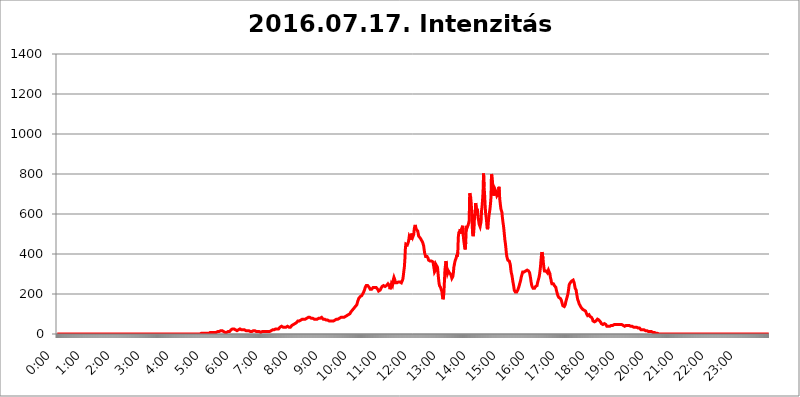
| Category | 2016.07.17. Intenzitás [W/m^2] |
|---|---|
| 0.0 | 0 |
| 0.0006944444444444445 | 0 |
| 0.001388888888888889 | 0 |
| 0.0020833333333333333 | 0 |
| 0.002777777777777778 | 0 |
| 0.003472222222222222 | 0 |
| 0.004166666666666667 | 0 |
| 0.004861111111111111 | 0 |
| 0.005555555555555556 | 0 |
| 0.0062499999999999995 | 0 |
| 0.006944444444444444 | 0 |
| 0.007638888888888889 | 0 |
| 0.008333333333333333 | 0 |
| 0.009027777777777779 | 0 |
| 0.009722222222222222 | 0 |
| 0.010416666666666666 | 0 |
| 0.011111111111111112 | 0 |
| 0.011805555555555555 | 0 |
| 0.012499999999999999 | 0 |
| 0.013194444444444444 | 0 |
| 0.013888888888888888 | 0 |
| 0.014583333333333332 | 0 |
| 0.015277777777777777 | 0 |
| 0.015972222222222224 | 0 |
| 0.016666666666666666 | 0 |
| 0.017361111111111112 | 0 |
| 0.018055555555555557 | 0 |
| 0.01875 | 0 |
| 0.019444444444444445 | 0 |
| 0.02013888888888889 | 0 |
| 0.020833333333333332 | 0 |
| 0.02152777777777778 | 0 |
| 0.022222222222222223 | 0 |
| 0.02291666666666667 | 0 |
| 0.02361111111111111 | 0 |
| 0.024305555555555556 | 0 |
| 0.024999999999999998 | 0 |
| 0.025694444444444447 | 0 |
| 0.02638888888888889 | 0 |
| 0.027083333333333334 | 0 |
| 0.027777777777777776 | 0 |
| 0.02847222222222222 | 0 |
| 0.029166666666666664 | 0 |
| 0.029861111111111113 | 0 |
| 0.030555555555555555 | 0 |
| 0.03125 | 0 |
| 0.03194444444444445 | 0 |
| 0.03263888888888889 | 0 |
| 0.03333333333333333 | 0 |
| 0.034027777777777775 | 0 |
| 0.034722222222222224 | 0 |
| 0.035416666666666666 | 0 |
| 0.036111111111111115 | 0 |
| 0.03680555555555556 | 0 |
| 0.0375 | 0 |
| 0.03819444444444444 | 0 |
| 0.03888888888888889 | 0 |
| 0.03958333333333333 | 0 |
| 0.04027777777777778 | 0 |
| 0.04097222222222222 | 0 |
| 0.041666666666666664 | 0 |
| 0.042361111111111106 | 0 |
| 0.04305555555555556 | 0 |
| 0.043750000000000004 | 0 |
| 0.044444444444444446 | 0 |
| 0.04513888888888889 | 0 |
| 0.04583333333333334 | 0 |
| 0.04652777777777778 | 0 |
| 0.04722222222222222 | 0 |
| 0.04791666666666666 | 0 |
| 0.04861111111111111 | 0 |
| 0.049305555555555554 | 0 |
| 0.049999999999999996 | 0 |
| 0.05069444444444445 | 0 |
| 0.051388888888888894 | 0 |
| 0.052083333333333336 | 0 |
| 0.05277777777777778 | 0 |
| 0.05347222222222222 | 0 |
| 0.05416666666666667 | 0 |
| 0.05486111111111111 | 0 |
| 0.05555555555555555 | 0 |
| 0.05625 | 0 |
| 0.05694444444444444 | 0 |
| 0.057638888888888885 | 0 |
| 0.05833333333333333 | 0 |
| 0.05902777777777778 | 0 |
| 0.059722222222222225 | 0 |
| 0.06041666666666667 | 0 |
| 0.061111111111111116 | 0 |
| 0.06180555555555556 | 0 |
| 0.0625 | 0 |
| 0.06319444444444444 | 0 |
| 0.06388888888888888 | 0 |
| 0.06458333333333334 | 0 |
| 0.06527777777777778 | 0 |
| 0.06597222222222222 | 0 |
| 0.06666666666666667 | 0 |
| 0.06736111111111111 | 0 |
| 0.06805555555555555 | 0 |
| 0.06874999999999999 | 0 |
| 0.06944444444444443 | 0 |
| 0.07013888888888889 | 0 |
| 0.07083333333333333 | 0 |
| 0.07152777777777779 | 0 |
| 0.07222222222222223 | 0 |
| 0.07291666666666667 | 0 |
| 0.07361111111111111 | 0 |
| 0.07430555555555556 | 0 |
| 0.075 | 0 |
| 0.07569444444444444 | 0 |
| 0.0763888888888889 | 0 |
| 0.07708333333333334 | 0 |
| 0.07777777777777778 | 0 |
| 0.07847222222222222 | 0 |
| 0.07916666666666666 | 0 |
| 0.0798611111111111 | 0 |
| 0.08055555555555556 | 0 |
| 0.08125 | 0 |
| 0.08194444444444444 | 0 |
| 0.08263888888888889 | 0 |
| 0.08333333333333333 | 0 |
| 0.08402777777777777 | 0 |
| 0.08472222222222221 | 0 |
| 0.08541666666666665 | 0 |
| 0.08611111111111112 | 0 |
| 0.08680555555555557 | 0 |
| 0.08750000000000001 | 0 |
| 0.08819444444444445 | 0 |
| 0.08888888888888889 | 0 |
| 0.08958333333333333 | 0 |
| 0.09027777777777778 | 0 |
| 0.09097222222222222 | 0 |
| 0.09166666666666667 | 0 |
| 0.09236111111111112 | 0 |
| 0.09305555555555556 | 0 |
| 0.09375 | 0 |
| 0.09444444444444444 | 0 |
| 0.09513888888888888 | 0 |
| 0.09583333333333333 | 0 |
| 0.09652777777777777 | 0 |
| 0.09722222222222222 | 0 |
| 0.09791666666666667 | 0 |
| 0.09861111111111111 | 0 |
| 0.09930555555555555 | 0 |
| 0.09999999999999999 | 0 |
| 0.10069444444444443 | 0 |
| 0.1013888888888889 | 0 |
| 0.10208333333333335 | 0 |
| 0.10277777777777779 | 0 |
| 0.10347222222222223 | 0 |
| 0.10416666666666667 | 0 |
| 0.10486111111111111 | 0 |
| 0.10555555555555556 | 0 |
| 0.10625 | 0 |
| 0.10694444444444444 | 0 |
| 0.1076388888888889 | 0 |
| 0.10833333333333334 | 0 |
| 0.10902777777777778 | 0 |
| 0.10972222222222222 | 0 |
| 0.1111111111111111 | 0 |
| 0.11180555555555556 | 0 |
| 0.11180555555555556 | 0 |
| 0.1125 | 0 |
| 0.11319444444444444 | 0 |
| 0.11388888888888889 | 0 |
| 0.11458333333333333 | 0 |
| 0.11527777777777777 | 0 |
| 0.11597222222222221 | 0 |
| 0.11666666666666665 | 0 |
| 0.1173611111111111 | 0 |
| 0.11805555555555557 | 0 |
| 0.11944444444444445 | 0 |
| 0.12013888888888889 | 0 |
| 0.12083333333333333 | 0 |
| 0.12152777777777778 | 0 |
| 0.12222222222222223 | 0 |
| 0.12291666666666667 | 0 |
| 0.12291666666666667 | 0 |
| 0.12361111111111112 | 0 |
| 0.12430555555555556 | 0 |
| 0.125 | 0 |
| 0.12569444444444444 | 0 |
| 0.12638888888888888 | 0 |
| 0.12708333333333333 | 0 |
| 0.16875 | 0 |
| 0.12847222222222224 | 0 |
| 0.12916666666666668 | 0 |
| 0.12986111111111112 | 0 |
| 0.13055555555555556 | 0 |
| 0.13125 | 0 |
| 0.13194444444444445 | 0 |
| 0.1326388888888889 | 0 |
| 0.13333333333333333 | 0 |
| 0.13402777777777777 | 0 |
| 0.13402777777777777 | 0 |
| 0.13472222222222222 | 0 |
| 0.13541666666666666 | 0 |
| 0.1361111111111111 | 0 |
| 0.13749999999999998 | 0 |
| 0.13819444444444443 | 0 |
| 0.1388888888888889 | 0 |
| 0.13958333333333334 | 0 |
| 0.14027777777777778 | 0 |
| 0.14097222222222222 | 0 |
| 0.14166666666666666 | 0 |
| 0.1423611111111111 | 0 |
| 0.14305555555555557 | 0 |
| 0.14375000000000002 | 0 |
| 0.14444444444444446 | 0 |
| 0.1451388888888889 | 0 |
| 0.1451388888888889 | 0 |
| 0.14652777777777778 | 0 |
| 0.14722222222222223 | 0 |
| 0.14791666666666667 | 0 |
| 0.1486111111111111 | 0 |
| 0.14930555555555555 | 0 |
| 0.15 | 0 |
| 0.15069444444444444 | 0 |
| 0.15138888888888888 | 0 |
| 0.15208333333333332 | 0 |
| 0.15277777777777776 | 0 |
| 0.15347222222222223 | 0 |
| 0.15416666666666667 | 0 |
| 0.15486111111111112 | 0 |
| 0.15555555555555556 | 0 |
| 0.15625 | 0 |
| 0.15694444444444444 | 0 |
| 0.15763888888888888 | 0 |
| 0.15833333333333333 | 0 |
| 0.15902777777777777 | 0 |
| 0.15972222222222224 | 0 |
| 0.16041666666666668 | 0 |
| 0.16111111111111112 | 0 |
| 0.16180555555555556 | 0 |
| 0.1625 | 0 |
| 0.16319444444444445 | 0 |
| 0.1638888888888889 | 0 |
| 0.16458333333333333 | 0 |
| 0.16527777777777777 | 0 |
| 0.16597222222222222 | 0 |
| 0.16666666666666666 | 0 |
| 0.1673611111111111 | 0 |
| 0.16805555555555554 | 0 |
| 0.16874999999999998 | 0 |
| 0.16944444444444443 | 0 |
| 0.17013888888888887 | 0 |
| 0.1708333333333333 | 0 |
| 0.17152777777777775 | 0 |
| 0.17222222222222225 | 0 |
| 0.1729166666666667 | 0 |
| 0.17361111111111113 | 0 |
| 0.17430555555555557 | 0 |
| 0.17500000000000002 | 0 |
| 0.17569444444444446 | 0 |
| 0.1763888888888889 | 0 |
| 0.17708333333333334 | 0 |
| 0.17777777777777778 | 0 |
| 0.17847222222222223 | 0 |
| 0.17916666666666667 | 0 |
| 0.1798611111111111 | 0 |
| 0.18055555555555555 | 0 |
| 0.18125 | 0 |
| 0.18194444444444444 | 0 |
| 0.1826388888888889 | 0 |
| 0.18333333333333335 | 0 |
| 0.1840277777777778 | 0 |
| 0.18472222222222223 | 0 |
| 0.18541666666666667 | 0 |
| 0.18611111111111112 | 0 |
| 0.18680555555555556 | 0 |
| 0.1875 | 0 |
| 0.18819444444444444 | 0 |
| 0.18888888888888888 | 0 |
| 0.18958333333333333 | 0 |
| 0.19027777777777777 | 0 |
| 0.1909722222222222 | 0 |
| 0.19166666666666665 | 0 |
| 0.19236111111111112 | 0 |
| 0.19305555555555554 | 0 |
| 0.19375 | 0 |
| 0.19444444444444445 | 0 |
| 0.1951388888888889 | 0 |
| 0.19583333333333333 | 0 |
| 0.19652777777777777 | 0 |
| 0.19722222222222222 | 0 |
| 0.19791666666666666 | 0 |
| 0.1986111111111111 | 0 |
| 0.19930555555555554 | 0 |
| 0.19999999999999998 | 0 |
| 0.20069444444444443 | 0 |
| 0.20138888888888887 | 3.525 |
| 0.2020833333333333 | 3.525 |
| 0.2027777777777778 | 3.525 |
| 0.2034722222222222 | 3.525 |
| 0.2041666666666667 | 3.525 |
| 0.20486111111111113 | 3.525 |
| 0.20555555555555557 | 3.525 |
| 0.20625000000000002 | 3.525 |
| 0.20694444444444446 | 3.525 |
| 0.2076388888888889 | 3.525 |
| 0.20833333333333334 | 3.525 |
| 0.20902777777777778 | 3.525 |
| 0.20972222222222223 | 3.525 |
| 0.21041666666666667 | 3.525 |
| 0.2111111111111111 | 3.525 |
| 0.21180555555555555 | 3.525 |
| 0.2125 | 3.525 |
| 0.21319444444444444 | 7.887 |
| 0.2138888888888889 | 3.525 |
| 0.21458333333333335 | 7.887 |
| 0.2152777777777778 | 7.887 |
| 0.21597222222222223 | 7.887 |
| 0.21666666666666667 | 7.887 |
| 0.21736111111111112 | 7.887 |
| 0.21805555555555556 | 7.887 |
| 0.21875 | 7.887 |
| 0.21944444444444444 | 7.887 |
| 0.22013888888888888 | 7.887 |
| 0.22083333333333333 | 7.887 |
| 0.22152777777777777 | 12.257 |
| 0.2222222222222222 | 7.887 |
| 0.22291666666666665 | 7.887 |
| 0.2236111111111111 | 12.257 |
| 0.22430555555555556 | 12.257 |
| 0.225 | 12.257 |
| 0.22569444444444445 | 12.257 |
| 0.2263888888888889 | 12.257 |
| 0.22708333333333333 | 12.257 |
| 0.22777777777777777 | 12.257 |
| 0.22847222222222222 | 16.636 |
| 0.22916666666666666 | 16.636 |
| 0.2298611111111111 | 16.636 |
| 0.23055555555555554 | 16.636 |
| 0.23124999999999998 | 16.636 |
| 0.23194444444444443 | 16.636 |
| 0.23263888888888887 | 12.257 |
| 0.2333333333333333 | 12.257 |
| 0.2340277777777778 | 12.257 |
| 0.2347222222222222 | 12.257 |
| 0.2354166666666667 | 7.887 |
| 0.23611111111111113 | 7.887 |
| 0.23680555555555557 | 7.887 |
| 0.23750000000000002 | 7.887 |
| 0.23819444444444446 | 7.887 |
| 0.2388888888888889 | 7.887 |
| 0.23958333333333334 | 12.257 |
| 0.24027777777777778 | 12.257 |
| 0.24097222222222223 | 12.257 |
| 0.24166666666666667 | 12.257 |
| 0.2423611111111111 | 12.257 |
| 0.24305555555555555 | 16.636 |
| 0.24375 | 21.024 |
| 0.24444444444444446 | 21.024 |
| 0.24513888888888888 | 21.024 |
| 0.24583333333333335 | 25.419 |
| 0.2465277777777778 | 25.419 |
| 0.24722222222222223 | 25.419 |
| 0.24791666666666667 | 25.419 |
| 0.24861111111111112 | 21.024 |
| 0.24930555555555556 | 21.024 |
| 0.25 | 21.024 |
| 0.25069444444444444 | 21.024 |
| 0.2513888888888889 | 16.636 |
| 0.2520833333333333 | 16.636 |
| 0.25277777777777777 | 21.024 |
| 0.2534722222222222 | 21.024 |
| 0.25416666666666665 | 21.024 |
| 0.2548611111111111 | 25.419 |
| 0.2555555555555556 | 25.419 |
| 0.25625000000000003 | 25.419 |
| 0.2569444444444445 | 25.419 |
| 0.2576388888888889 | 21.024 |
| 0.25833333333333336 | 21.024 |
| 0.2590277777777778 | 21.024 |
| 0.25972222222222224 | 21.024 |
| 0.2604166666666667 | 21.024 |
| 0.2611111111111111 | 21.024 |
| 0.26180555555555557 | 21.024 |
| 0.2625 | 21.024 |
| 0.26319444444444445 | 21.024 |
| 0.2638888888888889 | 16.636 |
| 0.26458333333333334 | 16.636 |
| 0.2652777777777778 | 16.636 |
| 0.2659722222222222 | 16.636 |
| 0.26666666666666666 | 16.636 |
| 0.2673611111111111 | 16.636 |
| 0.26805555555555555 | 16.636 |
| 0.26875 | 16.636 |
| 0.26944444444444443 | 12.257 |
| 0.2701388888888889 | 12.257 |
| 0.2708333333333333 | 12.257 |
| 0.27152777777777776 | 12.257 |
| 0.2722222222222222 | 12.257 |
| 0.27291666666666664 | 12.257 |
| 0.2736111111111111 | 12.257 |
| 0.2743055555555555 | 16.636 |
| 0.27499999999999997 | 16.636 |
| 0.27569444444444446 | 12.257 |
| 0.27638888888888885 | 16.636 |
| 0.27708333333333335 | 16.636 |
| 0.2777777777777778 | 16.636 |
| 0.27847222222222223 | 16.636 |
| 0.2791666666666667 | 12.257 |
| 0.2798611111111111 | 12.257 |
| 0.28055555555555556 | 12.257 |
| 0.28125 | 12.257 |
| 0.28194444444444444 | 12.257 |
| 0.2826388888888889 | 12.257 |
| 0.2833333333333333 | 12.257 |
| 0.28402777777777777 | 12.257 |
| 0.2847222222222222 | 7.887 |
| 0.28541666666666665 | 7.887 |
| 0.28611111111111115 | 12.257 |
| 0.28680555555555554 | 12.257 |
| 0.28750000000000003 | 12.257 |
| 0.2881944444444445 | 7.887 |
| 0.2888888888888889 | 12.257 |
| 0.28958333333333336 | 12.257 |
| 0.2902777777777778 | 12.257 |
| 0.29097222222222224 | 12.257 |
| 0.2916666666666667 | 12.257 |
| 0.2923611111111111 | 12.257 |
| 0.29305555555555557 | 12.257 |
| 0.29375 | 12.257 |
| 0.29444444444444445 | 12.257 |
| 0.2951388888888889 | 12.257 |
| 0.29583333333333334 | 12.257 |
| 0.2965277777777778 | 12.257 |
| 0.2972222222222222 | 12.257 |
| 0.29791666666666666 | 12.257 |
| 0.2986111111111111 | 16.636 |
| 0.29930555555555555 | 16.636 |
| 0.3 | 16.636 |
| 0.30069444444444443 | 21.024 |
| 0.3013888888888889 | 21.024 |
| 0.3020833333333333 | 21.024 |
| 0.30277777777777776 | 21.024 |
| 0.3034722222222222 | 21.024 |
| 0.30416666666666664 | 21.024 |
| 0.3048611111111111 | 25.419 |
| 0.3055555555555555 | 25.419 |
| 0.30624999999999997 | 25.419 |
| 0.3069444444444444 | 25.419 |
| 0.3076388888888889 | 25.419 |
| 0.30833333333333335 | 25.419 |
| 0.3090277777777778 | 25.419 |
| 0.30972222222222223 | 25.419 |
| 0.3104166666666667 | 25.419 |
| 0.3111111111111111 | 29.823 |
| 0.31180555555555556 | 29.823 |
| 0.3125 | 34.234 |
| 0.31319444444444444 | 34.234 |
| 0.3138888888888889 | 38.653 |
| 0.3145833333333333 | 38.653 |
| 0.31527777777777777 | 38.653 |
| 0.3159722222222222 | 38.653 |
| 0.31666666666666665 | 34.234 |
| 0.31736111111111115 | 38.653 |
| 0.31805555555555554 | 34.234 |
| 0.31875000000000003 | 34.234 |
| 0.3194444444444445 | 34.234 |
| 0.3201388888888889 | 34.234 |
| 0.32083333333333336 | 34.234 |
| 0.3215277777777778 | 34.234 |
| 0.32222222222222224 | 34.234 |
| 0.3229166666666667 | 38.653 |
| 0.3236111111111111 | 34.234 |
| 0.32430555555555557 | 34.234 |
| 0.325 | 34.234 |
| 0.32569444444444445 | 29.823 |
| 0.3263888888888889 | 34.234 |
| 0.32708333333333334 | 34.234 |
| 0.3277777777777778 | 34.234 |
| 0.3284722222222222 | 38.653 |
| 0.32916666666666666 | 43.079 |
| 0.3298611111111111 | 43.079 |
| 0.33055555555555555 | 47.511 |
| 0.33125 | 47.511 |
| 0.33194444444444443 | 51.951 |
| 0.3326388888888889 | 51.951 |
| 0.3333333333333333 | 51.951 |
| 0.3340277777777778 | 56.398 |
| 0.3347222222222222 | 56.398 |
| 0.3354166666666667 | 56.398 |
| 0.3361111111111111 | 60.85 |
| 0.3368055555555556 | 60.85 |
| 0.33749999999999997 | 65.31 |
| 0.33819444444444446 | 65.31 |
| 0.33888888888888885 | 65.31 |
| 0.33958333333333335 | 65.31 |
| 0.34027777777777773 | 65.31 |
| 0.34097222222222223 | 69.775 |
| 0.3416666666666666 | 69.775 |
| 0.3423611111111111 | 74.246 |
| 0.3430555555555555 | 74.246 |
| 0.34375 | 74.246 |
| 0.3444444444444445 | 74.246 |
| 0.3451388888888889 | 74.246 |
| 0.3458333333333334 | 74.246 |
| 0.34652777777777777 | 74.246 |
| 0.34722222222222227 | 74.246 |
| 0.34791666666666665 | 74.246 |
| 0.34861111111111115 | 74.246 |
| 0.34930555555555554 | 78.722 |
| 0.35000000000000003 | 78.722 |
| 0.3506944444444444 | 83.205 |
| 0.3513888888888889 | 83.205 |
| 0.3520833333333333 | 83.205 |
| 0.3527777777777778 | 83.205 |
| 0.3534722222222222 | 83.205 |
| 0.3541666666666667 | 83.205 |
| 0.3548611111111111 | 83.205 |
| 0.35555555555555557 | 78.722 |
| 0.35625 | 78.722 |
| 0.35694444444444445 | 78.722 |
| 0.3576388888888889 | 78.722 |
| 0.35833333333333334 | 78.722 |
| 0.3590277777777778 | 74.246 |
| 0.3597222222222222 | 74.246 |
| 0.36041666666666666 | 74.246 |
| 0.3611111111111111 | 74.246 |
| 0.36180555555555555 | 74.246 |
| 0.3625 | 74.246 |
| 0.36319444444444443 | 74.246 |
| 0.3638888888888889 | 74.246 |
| 0.3645833333333333 | 74.246 |
| 0.3652777777777778 | 78.722 |
| 0.3659722222222222 | 78.722 |
| 0.3666666666666667 | 78.722 |
| 0.3673611111111111 | 78.722 |
| 0.3680555555555556 | 78.722 |
| 0.36874999999999997 | 78.722 |
| 0.36944444444444446 | 78.722 |
| 0.37013888888888885 | 83.205 |
| 0.37083333333333335 | 83.205 |
| 0.37152777777777773 | 78.722 |
| 0.37222222222222223 | 78.722 |
| 0.3729166666666666 | 74.246 |
| 0.3736111111111111 | 74.246 |
| 0.3743055555555555 | 74.246 |
| 0.375 | 74.246 |
| 0.3756944444444445 | 69.775 |
| 0.3763888888888889 | 69.775 |
| 0.3770833333333334 | 69.775 |
| 0.37777777777777777 | 69.775 |
| 0.37847222222222227 | 69.775 |
| 0.37916666666666665 | 69.775 |
| 0.37986111111111115 | 69.775 |
| 0.38055555555555554 | 65.31 |
| 0.38125000000000003 | 65.31 |
| 0.3819444444444444 | 65.31 |
| 0.3826388888888889 | 65.31 |
| 0.3833333333333333 | 65.31 |
| 0.3840277777777778 | 65.31 |
| 0.3847222222222222 | 65.31 |
| 0.3854166666666667 | 65.31 |
| 0.3861111111111111 | 65.31 |
| 0.38680555555555557 | 65.31 |
| 0.3875 | 65.31 |
| 0.38819444444444445 | 65.31 |
| 0.3888888888888889 | 69.775 |
| 0.38958333333333334 | 69.775 |
| 0.3902777777777778 | 69.775 |
| 0.3909722222222222 | 69.775 |
| 0.39166666666666666 | 74.246 |
| 0.3923611111111111 | 74.246 |
| 0.39305555555555555 | 74.246 |
| 0.39375 | 74.246 |
| 0.39444444444444443 | 74.246 |
| 0.3951388888888889 | 78.722 |
| 0.3958333333333333 | 78.722 |
| 0.3965277777777778 | 78.722 |
| 0.3972222222222222 | 83.205 |
| 0.3979166666666667 | 83.205 |
| 0.3986111111111111 | 83.205 |
| 0.3993055555555556 | 83.205 |
| 0.39999999999999997 | 83.205 |
| 0.40069444444444446 | 83.205 |
| 0.40138888888888885 | 83.205 |
| 0.40208333333333335 | 83.205 |
| 0.40277777777777773 | 83.205 |
| 0.40347222222222223 | 87.692 |
| 0.4041666666666666 | 87.692 |
| 0.4048611111111111 | 87.692 |
| 0.4055555555555555 | 87.692 |
| 0.40625 | 92.184 |
| 0.4069444444444445 | 92.184 |
| 0.4076388888888889 | 92.184 |
| 0.4083333333333334 | 96.682 |
| 0.40902777777777777 | 96.682 |
| 0.40972222222222227 | 101.184 |
| 0.41041666666666665 | 101.184 |
| 0.41111111111111115 | 105.69 |
| 0.41180555555555554 | 110.201 |
| 0.41250000000000003 | 110.201 |
| 0.4131944444444444 | 114.716 |
| 0.4138888888888889 | 119.235 |
| 0.4145833333333333 | 119.235 |
| 0.4152777777777778 | 123.758 |
| 0.4159722222222222 | 128.284 |
| 0.4166666666666667 | 128.284 |
| 0.4173611111111111 | 132.814 |
| 0.41805555555555557 | 137.347 |
| 0.41875 | 137.347 |
| 0.41944444444444445 | 141.884 |
| 0.4201388888888889 | 146.423 |
| 0.42083333333333334 | 155.509 |
| 0.4215277777777778 | 164.605 |
| 0.4222222222222222 | 169.156 |
| 0.42291666666666666 | 178.264 |
| 0.4236111111111111 | 182.82 |
| 0.42430555555555555 | 182.82 |
| 0.425 | 187.378 |
| 0.42569444444444443 | 187.378 |
| 0.4263888888888889 | 187.378 |
| 0.4270833333333333 | 191.937 |
| 0.4277777777777778 | 196.497 |
| 0.4284722222222222 | 201.058 |
| 0.4291666666666667 | 205.62 |
| 0.4298611111111111 | 210.182 |
| 0.4305555555555556 | 214.746 |
| 0.43124999999999997 | 223.873 |
| 0.43194444444444446 | 233 |
| 0.43263888888888885 | 237.564 |
| 0.43333333333333335 | 242.127 |
| 0.43402777777777773 | 246.689 |
| 0.43472222222222223 | 242.127 |
| 0.4354166666666666 | 242.127 |
| 0.4361111111111111 | 242.127 |
| 0.4368055555555555 | 237.564 |
| 0.4375 | 233 |
| 0.4381944444444445 | 228.436 |
| 0.4388888888888889 | 223.873 |
| 0.4395833333333334 | 223.873 |
| 0.44027777777777777 | 219.309 |
| 0.44097222222222227 | 223.873 |
| 0.44166666666666665 | 223.873 |
| 0.44236111111111115 | 228.436 |
| 0.44305555555555554 | 233 |
| 0.44375000000000003 | 233 |
| 0.4444444444444444 | 237.564 |
| 0.4451388888888889 | 233 |
| 0.4458333333333333 | 233 |
| 0.4465277777777778 | 233 |
| 0.4472222222222222 | 233 |
| 0.4479166666666667 | 233 |
| 0.4486111111111111 | 228.436 |
| 0.44930555555555557 | 223.873 |
| 0.45 | 219.309 |
| 0.45069444444444445 | 214.746 |
| 0.4513888888888889 | 214.746 |
| 0.45208333333333334 | 214.746 |
| 0.4527777777777778 | 219.309 |
| 0.4534722222222222 | 223.873 |
| 0.45416666666666666 | 228.436 |
| 0.4548611111111111 | 233 |
| 0.45555555555555555 | 237.564 |
| 0.45625 | 237.564 |
| 0.45694444444444443 | 237.564 |
| 0.4576388888888889 | 242.127 |
| 0.4583333333333333 | 237.564 |
| 0.4590277777777778 | 237.564 |
| 0.4597222222222222 | 237.564 |
| 0.4604166666666667 | 242.127 |
| 0.4611111111111111 | 242.127 |
| 0.4618055555555556 | 242.127 |
| 0.46249999999999997 | 246.689 |
| 0.46319444444444446 | 246.689 |
| 0.46388888888888885 | 251.251 |
| 0.46458333333333335 | 255.813 |
| 0.46527777777777773 | 255.813 |
| 0.46597222222222223 | 242.127 |
| 0.4666666666666666 | 223.873 |
| 0.4673611111111111 | 223.873 |
| 0.4680555555555555 | 237.564 |
| 0.46875 | 251.251 |
| 0.4694444444444445 | 246.689 |
| 0.4701388888888889 | 242.127 |
| 0.4708333333333334 | 255.813 |
| 0.47152777777777777 | 274.047 |
| 0.47222222222222227 | 283.156 |
| 0.47291666666666665 | 278.603 |
| 0.47361111111111115 | 269.49 |
| 0.47430555555555554 | 255.813 |
| 0.47500000000000003 | 255.813 |
| 0.4756944444444444 | 260.373 |
| 0.4763888888888889 | 255.813 |
| 0.4770833333333333 | 251.251 |
| 0.4777777777777778 | 255.813 |
| 0.4784722222222222 | 260.373 |
| 0.4791666666666667 | 264.932 |
| 0.4798611111111111 | 264.932 |
| 0.48055555555555557 | 260.373 |
| 0.48125 | 260.373 |
| 0.48194444444444445 | 260.373 |
| 0.4826388888888889 | 255.813 |
| 0.48333333333333334 | 255.813 |
| 0.4840277777777778 | 260.373 |
| 0.4847222222222222 | 274.047 |
| 0.48541666666666666 | 292.259 |
| 0.4861111111111111 | 314.98 |
| 0.48680555555555555 | 333.113 |
| 0.4875 | 369.23 |
| 0.48819444444444443 | 422.943 |
| 0.4888888888888889 | 449.551 |
| 0.4895833333333333 | 453.968 |
| 0.4902777777777778 | 449.551 |
| 0.4909722222222222 | 445.129 |
| 0.4916666666666667 | 449.551 |
| 0.4923611111111111 | 458.38 |
| 0.4930555555555556 | 471.582 |
| 0.49374999999999997 | 489.108 |
| 0.49444444444444446 | 493.475 |
| 0.49513888888888885 | 480.356 |
| 0.49583333333333335 | 471.582 |
| 0.49652777777777773 | 475.972 |
| 0.49722222222222223 | 502.192 |
| 0.4979166666666666 | 493.475 |
| 0.4986111111111111 | 484.735 |
| 0.4993055555555555 | 489.108 |
| 0.5 | 497.836 |
| 0.5006944444444444 | 523.88 |
| 0.5013888888888889 | 536.82 |
| 0.5020833333333333 | 545.416 |
| 0.5027777777777778 | 532.513 |
| 0.5034722222222222 | 523.88 |
| 0.5041666666666667 | 519.555 |
| 0.5048611111111111 | 519.555 |
| 0.5055555555555555 | 515.223 |
| 0.50625 | 502.192 |
| 0.5069444444444444 | 489.108 |
| 0.5076388888888889 | 489.108 |
| 0.5083333333333333 | 484.735 |
| 0.5090277777777777 | 480.356 |
| 0.5097222222222222 | 480.356 |
| 0.5104166666666666 | 475.972 |
| 0.5111111111111112 | 467.187 |
| 0.5118055555555555 | 462.786 |
| 0.5125000000000001 | 458.38 |
| 0.5131944444444444 | 449.551 |
| 0.513888888888889 | 440.702 |
| 0.5145833333333333 | 422.943 |
| 0.5152777777777778 | 405.108 |
| 0.5159722222222222 | 396.164 |
| 0.5166666666666667 | 387.202 |
| 0.517361111111111 | 387.202 |
| 0.5180555555555556 | 387.202 |
| 0.5187499999999999 | 387.202 |
| 0.5194444444444445 | 382.715 |
| 0.5201388888888888 | 378.224 |
| 0.5208333333333334 | 369.23 |
| 0.5215277777777778 | 369.23 |
| 0.5222222222222223 | 369.23 |
| 0.5229166666666667 | 364.728 |
| 0.5236111111111111 | 360.221 |
| 0.5243055555555556 | 360.221 |
| 0.525 | 364.728 |
| 0.5256944444444445 | 369.23 |
| 0.5263888888888889 | 369.23 |
| 0.5270833333333333 | 360.221 |
| 0.5277777777777778 | 342.162 |
| 0.5284722222222222 | 328.584 |
| 0.5291666666666667 | 310.44 |
| 0.5298611111111111 | 305.898 |
| 0.5305555555555556 | 319.517 |
| 0.53125 | 346.682 |
| 0.5319444444444444 | 346.682 |
| 0.5326388888888889 | 346.682 |
| 0.5333333333333333 | 333.113 |
| 0.5340277777777778 | 305.898 |
| 0.5347222222222222 | 278.603 |
| 0.5354166666666667 | 255.813 |
| 0.5361111111111111 | 242.127 |
| 0.5368055555555555 | 237.564 |
| 0.5375 | 233 |
| 0.5381944444444444 | 228.436 |
| 0.5388888888888889 | 219.309 |
| 0.5395833333333333 | 210.182 |
| 0.5402777777777777 | 187.378 |
| 0.5409722222222222 | 173.709 |
| 0.5416666666666666 | 182.82 |
| 0.5423611111111112 | 210.182 |
| 0.5430555555555555 | 264.932 |
| 0.5437500000000001 | 319.517 |
| 0.5444444444444444 | 342.162 |
| 0.545138888888889 | 364.728 |
| 0.5458333333333333 | 351.198 |
| 0.5465277777777778 | 314.98 |
| 0.5472222222222222 | 301.354 |
| 0.5479166666666667 | 301.354 |
| 0.548611111111111 | 314.98 |
| 0.5493055555555556 | 314.98 |
| 0.5499999999999999 | 305.898 |
| 0.5506944444444445 | 310.44 |
| 0.5513888888888888 | 310.44 |
| 0.5520833333333334 | 296.808 |
| 0.5527777777777778 | 292.259 |
| 0.5534722222222223 | 278.603 |
| 0.5541666666666667 | 274.047 |
| 0.5548611111111111 | 287.709 |
| 0.5555555555555556 | 305.898 |
| 0.55625 | 333.113 |
| 0.5569444444444445 | 346.682 |
| 0.5576388888888889 | 360.221 |
| 0.5583333333333333 | 369.23 |
| 0.5590277777777778 | 369.23 |
| 0.5597222222222222 | 382.715 |
| 0.5604166666666667 | 396.164 |
| 0.5611111111111111 | 387.202 |
| 0.5618055555555556 | 409.574 |
| 0.5625 | 484.735 |
| 0.5631944444444444 | 506.542 |
| 0.5638888888888889 | 502.192 |
| 0.5645833333333333 | 515.223 |
| 0.5652777777777778 | 523.88 |
| 0.5659722222222222 | 502.192 |
| 0.5666666666666667 | 506.542 |
| 0.5673611111111111 | 528.2 |
| 0.5680555555555555 | 528.2 |
| 0.56875 | 541.121 |
| 0.5694444444444444 | 493.475 |
| 0.5701388888888889 | 467.187 |
| 0.5708333333333333 | 467.187 |
| 0.5715277777777777 | 431.833 |
| 0.5722222222222222 | 422.943 |
| 0.5729166666666666 | 458.38 |
| 0.5736111111111112 | 528.2 |
| 0.5743055555555555 | 541.121 |
| 0.5750000000000001 | 532.513 |
| 0.5756944444444444 | 532.513 |
| 0.576388888888889 | 545.416 |
| 0.5770833333333333 | 541.121 |
| 0.5777777777777778 | 566.793 |
| 0.5784722222222222 | 703.762 |
| 0.5791666666666667 | 695.666 |
| 0.579861111111111 | 683.473 |
| 0.5805555555555556 | 654.791 |
| 0.5812499999999999 | 617.436 |
| 0.5819444444444445 | 545.416 |
| 0.5826388888888888 | 497.836 |
| 0.5833333333333334 | 489.108 |
| 0.5840277777777778 | 506.542 |
| 0.5847222222222223 | 541.121 |
| 0.5854166666666667 | 600.661 |
| 0.5861111111111111 | 592.233 |
| 0.5868055555555556 | 654.791 |
| 0.5875 | 650.667 |
| 0.5881944444444445 | 617.436 |
| 0.5888888888888889 | 625.784 |
| 0.5895833333333333 | 613.252 |
| 0.5902777777777778 | 579.542 |
| 0.5909722222222222 | 566.793 |
| 0.5916666666666667 | 549.704 |
| 0.5923611111111111 | 549.704 |
| 0.5930555555555556 | 536.82 |
| 0.59375 | 541.121 |
| 0.5944444444444444 | 562.53 |
| 0.5951388888888889 | 617.436 |
| 0.5958333333333333 | 638.256 |
| 0.5965277777777778 | 671.22 |
| 0.5972222222222222 | 711.832 |
| 0.5979166666666667 | 802.868 |
| 0.5986111111111111 | 735.89 |
| 0.5993055555555555 | 703.762 |
| 0.6 | 650.667 |
| 0.6006944444444444 | 609.062 |
| 0.6013888888888889 | 588.009 |
| 0.6020833333333333 | 566.793 |
| 0.6027777777777777 | 532.513 |
| 0.6034722222222222 | 523.88 |
| 0.6041666666666666 | 536.82 |
| 0.6048611111111112 | 571.049 |
| 0.6055555555555555 | 592.233 |
| 0.6062500000000001 | 609.062 |
| 0.6069444444444444 | 625.784 |
| 0.607638888888889 | 650.667 |
| 0.6083333333333333 | 683.473 |
| 0.6090277777777778 | 798.974 |
| 0.6097222222222222 | 791.169 |
| 0.6104166666666667 | 763.674 |
| 0.611111111111111 | 727.896 |
| 0.6118055555555556 | 699.717 |
| 0.6124999999999999 | 691.608 |
| 0.6131944444444445 | 711.832 |
| 0.6138888888888888 | 723.889 |
| 0.6145833333333334 | 719.877 |
| 0.6152777777777778 | 711.832 |
| 0.6159722222222223 | 703.762 |
| 0.6166666666666667 | 691.608 |
| 0.6173611111111111 | 695.666 |
| 0.6180555555555556 | 695.666 |
| 0.61875 | 703.762 |
| 0.6194444444444445 | 735.89 |
| 0.6201388888888889 | 699.717 |
| 0.6208333333333333 | 667.123 |
| 0.6215277777777778 | 646.537 |
| 0.6222222222222222 | 625.784 |
| 0.6229166666666667 | 625.784 |
| 0.6236111111111111 | 609.062 |
| 0.6243055555555556 | 583.779 |
| 0.625 | 562.53 |
| 0.6256944444444444 | 545.416 |
| 0.6263888888888889 | 523.88 |
| 0.6270833333333333 | 497.836 |
| 0.6277777777777778 | 471.582 |
| 0.6284722222222222 | 453.968 |
| 0.6291666666666667 | 431.833 |
| 0.6298611111111111 | 405.108 |
| 0.6305555555555555 | 387.202 |
| 0.63125 | 378.224 |
| 0.6319444444444444 | 369.23 |
| 0.6326388888888889 | 364.728 |
| 0.6333333333333333 | 369.23 |
| 0.6340277777777777 | 364.728 |
| 0.6347222222222222 | 360.221 |
| 0.6354166666666666 | 346.682 |
| 0.6361111111111112 | 324.052 |
| 0.6368055555555555 | 305.898 |
| 0.6375000000000001 | 296.808 |
| 0.6381944444444444 | 283.156 |
| 0.638888888888889 | 264.932 |
| 0.6395833333333333 | 251.251 |
| 0.6402777777777778 | 237.564 |
| 0.6409722222222222 | 219.309 |
| 0.6416666666666667 | 214.746 |
| 0.642361111111111 | 210.182 |
| 0.6430555555555556 | 205.62 |
| 0.6437499999999999 | 205.62 |
| 0.6444444444444445 | 210.182 |
| 0.6451388888888888 | 214.746 |
| 0.6458333333333334 | 219.309 |
| 0.6465277777777778 | 223.873 |
| 0.6472222222222223 | 233 |
| 0.6479166666666667 | 242.127 |
| 0.6486111111111111 | 251.251 |
| 0.6493055555555556 | 260.373 |
| 0.65 | 269.49 |
| 0.6506944444444445 | 283.156 |
| 0.6513888888888889 | 292.259 |
| 0.6520833333333333 | 301.354 |
| 0.6527777777777778 | 310.44 |
| 0.6534722222222222 | 310.44 |
| 0.6541666666666667 | 310.44 |
| 0.6548611111111111 | 310.44 |
| 0.6555555555555556 | 310.44 |
| 0.65625 | 310.44 |
| 0.6569444444444444 | 314.98 |
| 0.6576388888888889 | 314.98 |
| 0.6583333333333333 | 314.98 |
| 0.6590277777777778 | 319.517 |
| 0.6597222222222222 | 319.517 |
| 0.6604166666666667 | 314.98 |
| 0.6611111111111111 | 314.98 |
| 0.6618055555555555 | 314.98 |
| 0.6625 | 305.898 |
| 0.6631944444444444 | 292.259 |
| 0.6638888888888889 | 278.603 |
| 0.6645833333333333 | 260.373 |
| 0.6652777777777777 | 246.689 |
| 0.6659722222222222 | 237.564 |
| 0.6666666666666666 | 233 |
| 0.6673611111111111 | 228.436 |
| 0.6680555555555556 | 228.436 |
| 0.6687500000000001 | 228.436 |
| 0.6694444444444444 | 228.436 |
| 0.6701388888888888 | 233 |
| 0.6708333333333334 | 237.564 |
| 0.6715277777777778 | 237.564 |
| 0.6722222222222222 | 242.127 |
| 0.6729166666666666 | 242.127 |
| 0.6736111111111112 | 255.813 |
| 0.6743055555555556 | 264.932 |
| 0.6749999999999999 | 274.047 |
| 0.6756944444444444 | 283.156 |
| 0.6763888888888889 | 296.808 |
| 0.6770833333333334 | 314.98 |
| 0.6777777777777777 | 337.639 |
| 0.6784722222222223 | 369.23 |
| 0.6791666666666667 | 396.164 |
| 0.6798611111111111 | 409.574 |
| 0.6805555555555555 | 405.108 |
| 0.68125 | 378.224 |
| 0.6819444444444445 | 351.198 |
| 0.6826388888888889 | 328.584 |
| 0.6833333333333332 | 314.98 |
| 0.6840277777777778 | 314.98 |
| 0.6847222222222222 | 314.98 |
| 0.6854166666666667 | 314.98 |
| 0.686111111111111 | 310.44 |
| 0.6868055555555556 | 310.44 |
| 0.6875 | 305.898 |
| 0.6881944444444444 | 310.44 |
| 0.688888888888889 | 319.517 |
| 0.6895833333333333 | 324.052 |
| 0.6902777777777778 | 314.98 |
| 0.6909722222222222 | 301.354 |
| 0.6916666666666668 | 283.156 |
| 0.6923611111111111 | 274.047 |
| 0.6930555555555555 | 260.373 |
| 0.69375 | 251.251 |
| 0.6944444444444445 | 251.251 |
| 0.6951388888888889 | 251.251 |
| 0.6958333333333333 | 251.251 |
| 0.6965277777777777 | 246.689 |
| 0.6972222222222223 | 242.127 |
| 0.6979166666666666 | 242.127 |
| 0.6986111111111111 | 237.564 |
| 0.6993055555555556 | 233 |
| 0.7000000000000001 | 219.309 |
| 0.7006944444444444 | 210.182 |
| 0.7013888888888888 | 201.058 |
| 0.7020833333333334 | 191.937 |
| 0.7027777777777778 | 187.378 |
| 0.7034722222222222 | 182.82 |
| 0.7041666666666666 | 182.82 |
| 0.7048611111111112 | 182.82 |
| 0.7055555555555556 | 178.264 |
| 0.7062499999999999 | 173.709 |
| 0.7069444444444444 | 169.156 |
| 0.7076388888888889 | 160.056 |
| 0.7083333333333334 | 150.964 |
| 0.7090277777777777 | 141.884 |
| 0.7097222222222223 | 137.347 |
| 0.7104166666666667 | 137.347 |
| 0.7111111111111111 | 137.347 |
| 0.7118055555555555 | 141.884 |
| 0.7125 | 146.423 |
| 0.7131944444444445 | 160.056 |
| 0.7138888888888889 | 169.156 |
| 0.7145833333333332 | 178.264 |
| 0.7152777777777778 | 187.378 |
| 0.7159722222222222 | 196.497 |
| 0.7166666666666667 | 210.182 |
| 0.717361111111111 | 228.436 |
| 0.7180555555555556 | 246.689 |
| 0.71875 | 251.251 |
| 0.7194444444444444 | 255.813 |
| 0.720138888888889 | 260.373 |
| 0.7208333333333333 | 260.373 |
| 0.7215277777777778 | 264.932 |
| 0.7222222222222222 | 269.49 |
| 0.7229166666666668 | 269.49 |
| 0.7236111111111111 | 269.49 |
| 0.7243055555555555 | 264.932 |
| 0.725 | 255.813 |
| 0.7256944444444445 | 242.127 |
| 0.7263888888888889 | 228.436 |
| 0.7270833333333333 | 228.436 |
| 0.7277777777777777 | 219.309 |
| 0.7284722222222223 | 201.058 |
| 0.7291666666666666 | 187.378 |
| 0.7298611111111111 | 173.709 |
| 0.7305555555555556 | 169.156 |
| 0.7312500000000001 | 160.056 |
| 0.7319444444444444 | 150.964 |
| 0.7326388888888888 | 146.423 |
| 0.7333333333333334 | 141.884 |
| 0.7340277777777778 | 137.347 |
| 0.7347222222222222 | 132.814 |
| 0.7354166666666666 | 128.284 |
| 0.7361111111111112 | 128.284 |
| 0.7368055555555556 | 123.758 |
| 0.7374999999999999 | 119.235 |
| 0.7381944444444444 | 119.235 |
| 0.7388888888888889 | 119.235 |
| 0.7395833333333334 | 119.235 |
| 0.7402777777777777 | 119.235 |
| 0.7409722222222223 | 114.716 |
| 0.7416666666666667 | 110.201 |
| 0.7423611111111111 | 101.184 |
| 0.7430555555555555 | 96.682 |
| 0.74375 | 92.184 |
| 0.7444444444444445 | 92.184 |
| 0.7451388888888889 | 96.682 |
| 0.7458333333333332 | 96.682 |
| 0.7465277777777778 | 92.184 |
| 0.7472222222222222 | 87.692 |
| 0.7479166666666667 | 87.692 |
| 0.748611111111111 | 83.205 |
| 0.7493055555555556 | 83.205 |
| 0.75 | 78.722 |
| 0.7506944444444444 | 74.246 |
| 0.751388888888889 | 65.31 |
| 0.7520833333333333 | 65.31 |
| 0.7527777777777778 | 60.85 |
| 0.7534722222222222 | 60.85 |
| 0.7541666666666668 | 65.31 |
| 0.7548611111111111 | 65.31 |
| 0.7555555555555555 | 65.31 |
| 0.75625 | 69.775 |
| 0.7569444444444445 | 69.775 |
| 0.7576388888888889 | 74.246 |
| 0.7583333333333333 | 74.246 |
| 0.7590277777777777 | 74.246 |
| 0.7597222222222223 | 69.775 |
| 0.7604166666666666 | 69.775 |
| 0.7611111111111111 | 65.31 |
| 0.7618055555555556 | 60.85 |
| 0.7625000000000001 | 56.398 |
| 0.7631944444444444 | 51.951 |
| 0.7638888888888888 | 47.511 |
| 0.7645833333333334 | 47.511 |
| 0.7652777777777778 | 47.511 |
| 0.7659722222222222 | 51.951 |
| 0.7666666666666666 | 51.951 |
| 0.7673611111111112 | 51.951 |
| 0.7680555555555556 | 51.951 |
| 0.7687499999999999 | 47.511 |
| 0.7694444444444444 | 47.511 |
| 0.7701388888888889 | 43.079 |
| 0.7708333333333334 | 38.653 |
| 0.7715277777777777 | 38.653 |
| 0.7722222222222223 | 38.653 |
| 0.7729166666666667 | 38.653 |
| 0.7736111111111111 | 38.653 |
| 0.7743055555555555 | 38.653 |
| 0.775 | 38.653 |
| 0.7756944444444445 | 38.653 |
| 0.7763888888888889 | 38.653 |
| 0.7770833333333332 | 43.079 |
| 0.7777777777777778 | 43.079 |
| 0.7784722222222222 | 43.079 |
| 0.7791666666666667 | 43.079 |
| 0.779861111111111 | 43.079 |
| 0.7805555555555556 | 47.511 |
| 0.78125 | 47.511 |
| 0.7819444444444444 | 43.079 |
| 0.782638888888889 | 43.079 |
| 0.7833333333333333 | 47.511 |
| 0.7840277777777778 | 47.511 |
| 0.7847222222222222 | 47.511 |
| 0.7854166666666668 | 47.511 |
| 0.7861111111111111 | 47.511 |
| 0.7868055555555555 | 47.511 |
| 0.7875 | 47.511 |
| 0.7881944444444445 | 47.511 |
| 0.7888888888888889 | 47.511 |
| 0.7895833333333333 | 47.511 |
| 0.7902777777777777 | 47.511 |
| 0.7909722222222223 | 47.511 |
| 0.7916666666666666 | 47.511 |
| 0.7923611111111111 | 47.511 |
| 0.7930555555555556 | 43.079 |
| 0.7937500000000001 | 43.079 |
| 0.7944444444444444 | 43.079 |
| 0.7951388888888888 | 38.653 |
| 0.7958333333333334 | 38.653 |
| 0.7965277777777778 | 38.653 |
| 0.7972222222222222 | 43.079 |
| 0.7979166666666666 | 43.079 |
| 0.7986111111111112 | 43.079 |
| 0.7993055555555556 | 43.079 |
| 0.7999999999999999 | 43.079 |
| 0.8006944444444444 | 43.079 |
| 0.8013888888888889 | 43.079 |
| 0.8020833333333334 | 43.079 |
| 0.8027777777777777 | 38.653 |
| 0.8034722222222223 | 38.653 |
| 0.8041666666666667 | 38.653 |
| 0.8048611111111111 | 38.653 |
| 0.8055555555555555 | 38.653 |
| 0.80625 | 38.653 |
| 0.8069444444444445 | 38.653 |
| 0.8076388888888889 | 38.653 |
| 0.8083333333333332 | 34.234 |
| 0.8090277777777778 | 34.234 |
| 0.8097222222222222 | 34.234 |
| 0.8104166666666667 | 34.234 |
| 0.811111111111111 | 34.234 |
| 0.8118055555555556 | 34.234 |
| 0.8125 | 34.234 |
| 0.8131944444444444 | 29.823 |
| 0.813888888888889 | 29.823 |
| 0.8145833333333333 | 29.823 |
| 0.8152777777777778 | 29.823 |
| 0.8159722222222222 | 29.823 |
| 0.8166666666666668 | 29.823 |
| 0.8173611111111111 | 25.419 |
| 0.8180555555555555 | 25.419 |
| 0.81875 | 21.024 |
| 0.8194444444444445 | 21.024 |
| 0.8201388888888889 | 21.024 |
| 0.8208333333333333 | 21.024 |
| 0.8215277777777777 | 21.024 |
| 0.8222222222222223 | 21.024 |
| 0.8229166666666666 | 21.024 |
| 0.8236111111111111 | 21.024 |
| 0.8243055555555556 | 16.636 |
| 0.8250000000000001 | 16.636 |
| 0.8256944444444444 | 16.636 |
| 0.8263888888888888 | 16.636 |
| 0.8270833333333334 | 16.636 |
| 0.8277777777777778 | 12.257 |
| 0.8284722222222222 | 12.257 |
| 0.8291666666666666 | 12.257 |
| 0.8298611111111112 | 12.257 |
| 0.8305555555555556 | 12.257 |
| 0.8312499999999999 | 12.257 |
| 0.8319444444444444 | 12.257 |
| 0.8326388888888889 | 12.257 |
| 0.8333333333333334 | 12.257 |
| 0.8340277777777777 | 7.887 |
| 0.8347222222222223 | 7.887 |
| 0.8354166666666667 | 7.887 |
| 0.8361111111111111 | 7.887 |
| 0.8368055555555555 | 7.887 |
| 0.8375 | 7.887 |
| 0.8381944444444445 | 3.525 |
| 0.8388888888888889 | 3.525 |
| 0.8395833333333332 | 3.525 |
| 0.8402777777777778 | 3.525 |
| 0.8409722222222222 | 3.525 |
| 0.8416666666666667 | 3.525 |
| 0.842361111111111 | 0 |
| 0.8430555555555556 | 0 |
| 0.84375 | 0 |
| 0.8444444444444444 | 0 |
| 0.845138888888889 | 0 |
| 0.8458333333333333 | 0 |
| 0.8465277777777778 | 0 |
| 0.8472222222222222 | 0 |
| 0.8479166666666668 | 0 |
| 0.8486111111111111 | 0 |
| 0.8493055555555555 | 0 |
| 0.85 | 0 |
| 0.8506944444444445 | 0 |
| 0.8513888888888889 | 0 |
| 0.8520833333333333 | 0 |
| 0.8527777777777777 | 0 |
| 0.8534722222222223 | 0 |
| 0.8541666666666666 | 0 |
| 0.8548611111111111 | 0 |
| 0.8555555555555556 | 0 |
| 0.8562500000000001 | 0 |
| 0.8569444444444444 | 0 |
| 0.8576388888888888 | 0 |
| 0.8583333333333334 | 0 |
| 0.8590277777777778 | 0 |
| 0.8597222222222222 | 0 |
| 0.8604166666666666 | 0 |
| 0.8611111111111112 | 0 |
| 0.8618055555555556 | 0 |
| 0.8624999999999999 | 0 |
| 0.8631944444444444 | 0 |
| 0.8638888888888889 | 0 |
| 0.8645833333333334 | 0 |
| 0.8652777777777777 | 0 |
| 0.8659722222222223 | 0 |
| 0.8666666666666667 | 0 |
| 0.8673611111111111 | 0 |
| 0.8680555555555555 | 0 |
| 0.86875 | 0 |
| 0.8694444444444445 | 0 |
| 0.8701388888888889 | 0 |
| 0.8708333333333332 | 0 |
| 0.8715277777777778 | 0 |
| 0.8722222222222222 | 0 |
| 0.8729166666666667 | 0 |
| 0.873611111111111 | 0 |
| 0.8743055555555556 | 0 |
| 0.875 | 0 |
| 0.8756944444444444 | 0 |
| 0.876388888888889 | 0 |
| 0.8770833333333333 | 0 |
| 0.8777777777777778 | 0 |
| 0.8784722222222222 | 0 |
| 0.8791666666666668 | 0 |
| 0.8798611111111111 | 0 |
| 0.8805555555555555 | 0 |
| 0.88125 | 0 |
| 0.8819444444444445 | 0 |
| 0.8826388888888889 | 0 |
| 0.8833333333333333 | 0 |
| 0.8840277777777777 | 0 |
| 0.8847222222222223 | 0 |
| 0.8854166666666666 | 0 |
| 0.8861111111111111 | 0 |
| 0.8868055555555556 | 0 |
| 0.8875000000000001 | 0 |
| 0.8881944444444444 | 0 |
| 0.8888888888888888 | 0 |
| 0.8895833333333334 | 0 |
| 0.8902777777777778 | 0 |
| 0.8909722222222222 | 0 |
| 0.8916666666666666 | 0 |
| 0.8923611111111112 | 0 |
| 0.8930555555555556 | 0 |
| 0.8937499999999999 | 0 |
| 0.8944444444444444 | 0 |
| 0.8951388888888889 | 0 |
| 0.8958333333333334 | 0 |
| 0.8965277777777777 | 0 |
| 0.8972222222222223 | 0 |
| 0.8979166666666667 | 0 |
| 0.8986111111111111 | 0 |
| 0.8993055555555555 | 0 |
| 0.9 | 0 |
| 0.9006944444444445 | 0 |
| 0.9013888888888889 | 0 |
| 0.9020833333333332 | 0 |
| 0.9027777777777778 | 0 |
| 0.9034722222222222 | 0 |
| 0.9041666666666667 | 0 |
| 0.904861111111111 | 0 |
| 0.9055555555555556 | 0 |
| 0.90625 | 0 |
| 0.9069444444444444 | 0 |
| 0.907638888888889 | 0 |
| 0.9083333333333333 | 0 |
| 0.9090277777777778 | 0 |
| 0.9097222222222222 | 0 |
| 0.9104166666666668 | 0 |
| 0.9111111111111111 | 0 |
| 0.9118055555555555 | 0 |
| 0.9125 | 0 |
| 0.9131944444444445 | 0 |
| 0.9138888888888889 | 0 |
| 0.9145833333333333 | 0 |
| 0.9152777777777777 | 0 |
| 0.9159722222222223 | 0 |
| 0.9166666666666666 | 0 |
| 0.9173611111111111 | 0 |
| 0.9180555555555556 | 0 |
| 0.9187500000000001 | 0 |
| 0.9194444444444444 | 0 |
| 0.9201388888888888 | 0 |
| 0.9208333333333334 | 0 |
| 0.9215277777777778 | 0 |
| 0.9222222222222222 | 0 |
| 0.9229166666666666 | 0 |
| 0.9236111111111112 | 0 |
| 0.9243055555555556 | 0 |
| 0.9249999999999999 | 0 |
| 0.9256944444444444 | 0 |
| 0.9263888888888889 | 0 |
| 0.9270833333333334 | 0 |
| 0.9277777777777777 | 0 |
| 0.9284722222222223 | 0 |
| 0.9291666666666667 | 0 |
| 0.9298611111111111 | 0 |
| 0.9305555555555555 | 0 |
| 0.93125 | 0 |
| 0.9319444444444445 | 0 |
| 0.9326388888888889 | 0 |
| 0.9333333333333332 | 0 |
| 0.9340277777777778 | 0 |
| 0.9347222222222222 | 0 |
| 0.9354166666666667 | 0 |
| 0.936111111111111 | 0 |
| 0.9368055555555556 | 0 |
| 0.9375 | 0 |
| 0.9381944444444444 | 0 |
| 0.938888888888889 | 0 |
| 0.9395833333333333 | 0 |
| 0.9402777777777778 | 0 |
| 0.9409722222222222 | 0 |
| 0.9416666666666668 | 0 |
| 0.9423611111111111 | 0 |
| 0.9430555555555555 | 0 |
| 0.94375 | 0 |
| 0.9444444444444445 | 0 |
| 0.9451388888888889 | 0 |
| 0.9458333333333333 | 0 |
| 0.9465277777777777 | 0 |
| 0.9472222222222223 | 0 |
| 0.9479166666666666 | 0 |
| 0.9486111111111111 | 0 |
| 0.9493055555555556 | 0 |
| 0.9500000000000001 | 0 |
| 0.9506944444444444 | 0 |
| 0.9513888888888888 | 0 |
| 0.9520833333333334 | 0 |
| 0.9527777777777778 | 0 |
| 0.9534722222222222 | 0 |
| 0.9541666666666666 | 0 |
| 0.9548611111111112 | 0 |
| 0.9555555555555556 | 0 |
| 0.9562499999999999 | 0 |
| 0.9569444444444444 | 0 |
| 0.9576388888888889 | 0 |
| 0.9583333333333334 | 0 |
| 0.9590277777777777 | 0 |
| 0.9597222222222223 | 0 |
| 0.9604166666666667 | 0 |
| 0.9611111111111111 | 0 |
| 0.9618055555555555 | 0 |
| 0.9625 | 0 |
| 0.9631944444444445 | 0 |
| 0.9638888888888889 | 0 |
| 0.9645833333333332 | 0 |
| 0.9652777777777778 | 0 |
| 0.9659722222222222 | 0 |
| 0.9666666666666667 | 0 |
| 0.967361111111111 | 0 |
| 0.9680555555555556 | 0 |
| 0.96875 | 0 |
| 0.9694444444444444 | 0 |
| 0.970138888888889 | 0 |
| 0.9708333333333333 | 0 |
| 0.9715277777777778 | 0 |
| 0.9722222222222222 | 0 |
| 0.9729166666666668 | 0 |
| 0.9736111111111111 | 0 |
| 0.9743055555555555 | 0 |
| 0.975 | 0 |
| 0.9756944444444445 | 0 |
| 0.9763888888888889 | 0 |
| 0.9770833333333333 | 0 |
| 0.9777777777777777 | 0 |
| 0.9784722222222223 | 0 |
| 0.9791666666666666 | 0 |
| 0.9798611111111111 | 0 |
| 0.9805555555555556 | 0 |
| 0.9812500000000001 | 0 |
| 0.9819444444444444 | 0 |
| 0.9826388888888888 | 0 |
| 0.9833333333333334 | 0 |
| 0.9840277777777778 | 0 |
| 0.9847222222222222 | 0 |
| 0.9854166666666666 | 0 |
| 0.9861111111111112 | 0 |
| 0.9868055555555556 | 0 |
| 0.9874999999999999 | 0 |
| 0.9881944444444444 | 0 |
| 0.9888888888888889 | 0 |
| 0.9895833333333334 | 0 |
| 0.9902777777777777 | 0 |
| 0.9909722222222223 | 0 |
| 0.9916666666666667 | 0 |
| 0.9923611111111111 | 0 |
| 0.9930555555555555 | 0 |
| 0.99375 | 0 |
| 0.9944444444444445 | 0 |
| 0.9951388888888889 | 0 |
| 0.9958333333333332 | 0 |
| 0.9965277777777778 | 0 |
| 0.9972222222222222 | 0 |
| 0.9979166666666667 | 0 |
| 0.998611111111111 | 0 |
| 0.9993055555555556 | 0 |